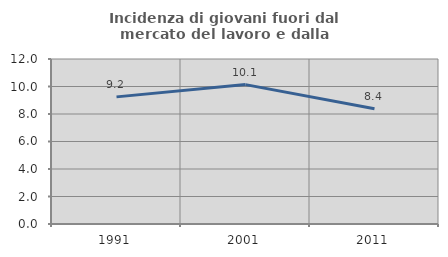
| Category | Incidenza di giovani fuori dal mercato del lavoro e dalla formazione  |
|---|---|
| 1991.0 | 9.245 |
| 2001.0 | 10.137 |
| 2011.0 | 8.387 |